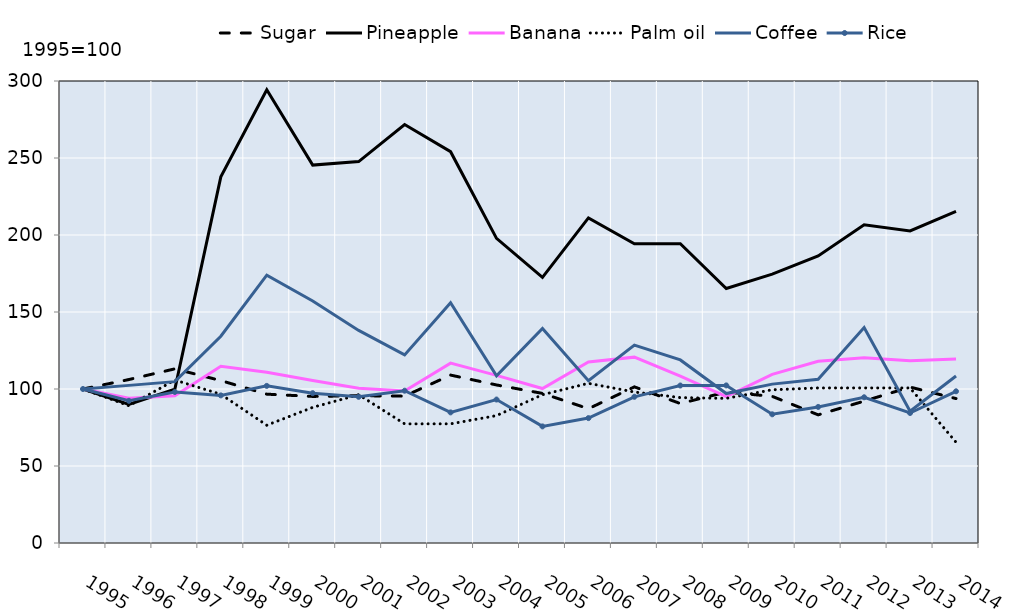
| Category | Sugar | Pineapple | Banana | Palm oil | Coffee | Rice |
|---|---|---|---|---|---|---|
| 1995.0 | 100 | 100 | 100 | 100 | 100 | 100 |
| 1996.0 | 106.146 | 90.014 | 93.964 | 89.129 | 102.354 | 92.326 |
| 1997.0 | 113.089 | 99.882 | 95.545 | 105.817 | 104.763 | 98.054 |
| 1998.0 | 105.467 | 237.761 | 114.759 | 96.555 | 134.256 | 95.842 |
| 1999.0 | 96.643 | 294.36 | 110.888 | 76.486 | 173.883 | 102.019 |
| 2000.0 | 95.178 | 245.404 | 105.54 | 88.07 | 157.194 | 97.277 |
| 2001.0 | 95.625 | 247.65 | 100.438 | 96.306 | 138.033 | 94.924 |
| 2002.0 | 95.356 | 271.727 | 98.678 | 77.358 | 122.127 | 98.894 |
| 2003.0 | 109.039 | 254.107 | 116.803 | 77.373 | 156.079 | 84.807 |
| 2004.0 | 102.629 | 197.795 | 108.822 | 82.716 | 108.496 | 93.159 |
| 2005.0 | 97.148 | 172.497 | 100.307 | 96.296 | 139.276 | 75.707 |
| 2006.0 | 87.191 | 211.086 | 117.569 | 103.69 | 105.324 | 81.106 |
| 2007.0 | 101.381 | 194.317 | 120.682 | 98.051 | 128.538 | 94.933 |
| 2008.0 | 90.566 | 194.333 | 108.407 | 94.411 | 118.876 | 102.264 |
| 2009.0 | 98.019 | 165.249 | 95.059 | 93.906 | 97.05 | 102.332 |
| 2010.0 | 95.22 | 174.565 | 109.465 | 99.498 | 103.175 | 83.573 |
| 2011.0 | 83.218 | 186.359 | 117.958 | 100.679 | 106.267 | 88.359 |
| 2012.0 | 92.127 | 206.678 | 120.271 | 100.679 | 139.876 | 94.627 |
| 2013.0 | 101.238 | 202.673 | 118.397 | 100.679 | 85.526 | 84.414 |
| 2014.0 | 93.79 | 215.287 | 119.483 | 65.441 | 108.434 | 98.504 |